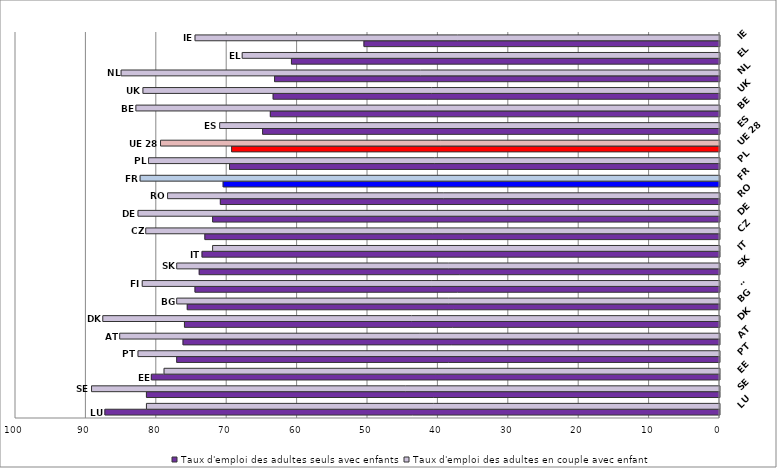
| Category | Taux d'emploi des adultes seuls avec enfants | Taux d'emploi des adultes en couple avec enfant |
|---|---|---|
| LU | 87.3 | 81.4 |
| SE | 81.4 | 89.2 |
| EE | 80.7 | 78.9 |
| PT | 77.1 | 82.6 |
| AT | 76.2 | 85.2 |
| DK | 76 | 87.6 |
| BG | 75.6 | 77.1 |
| FI | 74.5 | 82 |
| SK | 73.9 | 77.1 |
| IT | 73.5 | 72 |
| CZ | 73.1 | 81.5 |
| DE | 72 | 82.6 |
| RO | 70.9 | 78.4 |
| FR | 70.5 | 82.3 |
| PL | 69.6 | 81.1 |
| UE 28 | 69.3 | 79.4 |
| ES | 64.9 | 71 |
| BE | 63.8 | 82.9 |
| UK | 63.4 | 81.9 |
| NL | 63.2 | 85 |
| EL | 60.8 | 67.8 |
| IE | 50.5 | 74.5 |